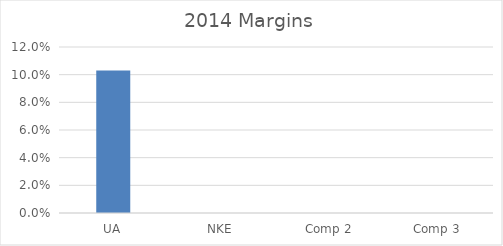
| Category | 2014 Margins |
|---|---|
| UA | 0.103 |
| NKE | 0 |
| Comp 2 | 0 |
| Comp 3 | 0 |